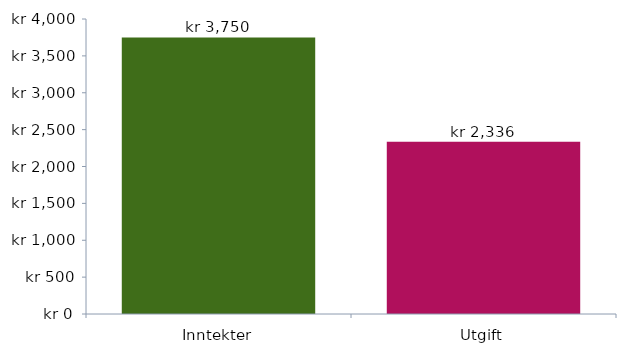
| Category | Diagramdata |
|---|---|
| 0 | 3750 |
| 1 | 2336 |